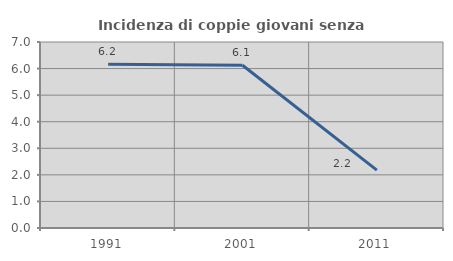
| Category | Incidenza di coppie giovani senza figli |
|---|---|
| 1991.0 | 6.159 |
| 2001.0 | 6.126 |
| 2011.0 | 2.178 |